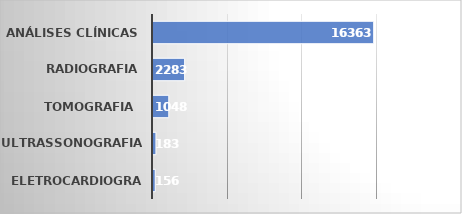
| Category | Series 0 |
|---|---|
| ELETROCARDIOGRAMA | 150 |
| ULTRASSONOGRAFIA | 198 |
| TOMOGRAFIA  | 1060 |
| RADIOGRAFIA | 2124 |
| ANÁLISES CLÍNICAS | 14812 |